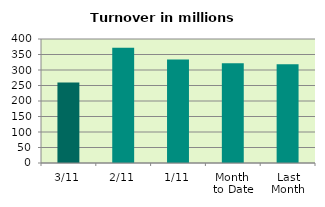
| Category | Series 0 |
|---|---|
| 3/11 | 259.92 |
| 2/11 | 371.617 |
| 1/11 | 333.873 |
| Month 
to Date | 321.803 |
| Last
Month | 318.176 |